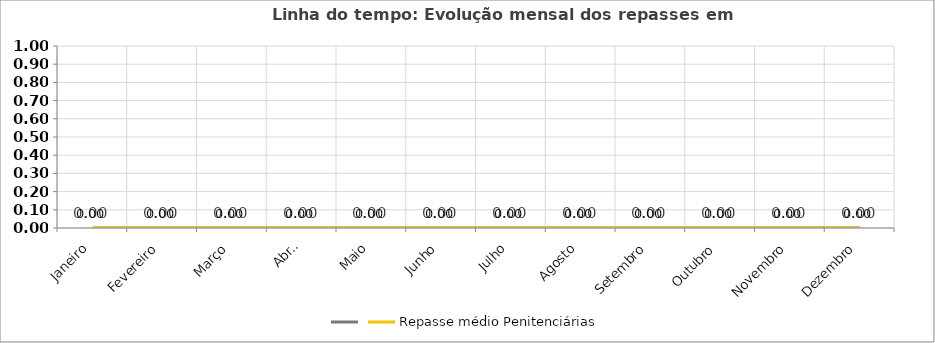
| Category | Series 0 | Repasse médio Penitenciárias |
|---|---|---|
| Janeiro | 0 | 0 |
| Fevereiro | 0 | 0 |
| Março | 0 | 0 |
| Abril | 0 | 0 |
| Maio | 0 | 0 |
| Junho | 0 | 0 |
| Julho | 0 | 0 |
| Agosto | 0 | 0 |
| Setembro | 0 | 0 |
| Outubro | 0 | 0 |
| Novembro | 0 | 0 |
| Dezembro | 0 | 0 |